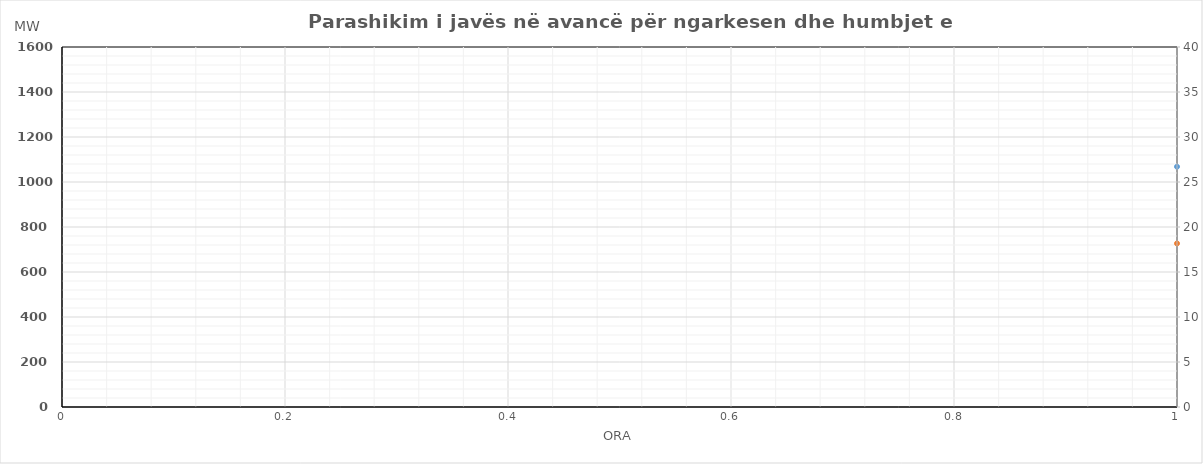
| Category | Ngarkesa (MWh) |
|---|---|
| 0 | 726.941 |
| 1 | 642.054 |
| 2 | 579.283 |
| 3 | 554.908 |
| 4 | 554.458 |
| 5 | 604.217 |
| 6 | 725.592 |
| 7 | 909.808 |
| 8 | 1090.877 |
| 9 | 1157.138 |
| 10 | 1144.061 |
| 11 | 1114.673 |
| 12 | 1110.123 |
| 13 | 1130.889 |
| 14 | 1131 |
| 15 | 1153.556 |
| 16 | 1224.786 |
| 17 | 1349.172 |
| 18 | 1363.365 |
| 19 | 1359.373 |
| 20 | 1310.942 |
| 21 | 1188.383 |
| 22 | 1028.367 |
| 23 | 861.787 |
| 24 | 728.312 |
| 25 | 631.982 |
| 26 | 571.265 |
| 27 | 548.223 |
| 28 | 548.508 |
| 29 | 591.424 |
| 30 | 732.503 |
| 31 | 946.257 |
| 32 | 1094.437 |
| 33 | 1136.702 |
| 34 | 1132.65 |
| 35 | 1115.623 |
| 36 | 1110.276 |
| 37 | 1116.502 |
| 38 | 1113.434 |
| 39 | 1128.112 |
| 40 | 1204.763 |
| 41 | 1312.687 |
| 42 | 1324.339 |
| 43 | 1317.109 |
| 44 | 1266.417 |
| 45 | 1147.149 |
| 46 | 965.113 |
| 47 | 777.027 |
| 48 | 684.763 |
| 49 | 603.225 |
| 50 | 568.87 |
| 51 | 560.554 |
| 52 | 567.641 |
| 53 | 621.65 |
| 54 | 780.791 |
| 55 | 1021.981 |
| 56 | 1151.173 |
| 57 | 1169.899 |
| 58 | 1142.502 |
| 59 | 1124.675 |
| 60 | 1116.155 |
| 61 | 1125.119 |
| 62 | 1126.915 |
| 63 | 1137.301 |
| 64 | 1198.093 |
| 65 | 1297.763 |
| 66 | 1298.464 |
| 67 | 1281.13 |
| 68 | 1235.153 |
| 69 | 1118.443 |
| 70 | 958.055 |
| 71 | 793.458 |
| 72 | 750.08 |
| 73 | 657.031 |
| 74 | 598.135 |
| 75 | 571.537 |
| 76 | 572.15 |
| 77 | 616.353 |
| 78 | 730.369 |
| 79 | 913.775 |
| 80 | 1070.728 |
| 81 | 1109.616 |
| 82 | 1083.069 |
| 83 | 1055.436 |
| 84 | 1042.625 |
| 85 | 1042.142 |
| 86 | 1052.845 |
| 87 | 1078.115 |
| 88 | 1183.127 |
| 89 | 1325.387 |
| 90 | 1347.361 |
| 91 | 1348.665 |
| 92 | 1306.297 |
| 93 | 1188.441 |
| 94 | 1020.752 |
| 95 | 832.065 |
| 96 | 677.938 |
| 97 | 605.796 |
| 98 | 574.146 |
| 99 | 562.861 |
| 100 | 568.676 |
| 101 | 629.303 |
| 102 | 809.988 |
| 103 | 1068.705 |
| 104 | 1179.917 |
| 105 | 1181.059 |
| 106 | 1147.866 |
| 107 | 1118.039 |
| 108 | 1081.987 |
| 109 | 1107.467 |
| 110 | 1156.88 |
| 111 | 1177.525 |
| 112 | 1241.343 |
| 113 | 1340.581 |
| 114 | 1334.715 |
| 115 | 1317.462 |
| 116 | 1290.89 |
| 117 | 1172.423 |
| 118 | 1006.297 |
| 119 | 832.486 |
| 120 | 671.762 |
| 121 | 590.908 |
| 122 | 553.95 |
| 123 | 540.179 |
| 124 | 544.961 |
| 125 | 602.11 |
| 126 | 737.248 |
| 127 | 939.262 |
| 128 | 1098.275 |
| 129 | 1151.432 |
| 130 | 1137.56 |
| 131 | 1112.734 |
| 132 | 1109.37 |
| 133 | 1140.559 |
| 134 | 1150.199 |
| 135 | 1168.193 |
| 136 | 1220.98 |
| 137 | 1326.464 |
| 138 | 1323.306 |
| 139 | 1311.895 |
| 140 | 1271.586 |
| 141 | 1149.139 |
| 142 | 996.427 |
| 143 | 840.556 |
| 144 | 752.45 |
| 145 | 664.387 |
| 146 | 604.766 |
| 147 | 579.916 |
| 148 | 577.888 |
| 149 | 624.42 |
| 150 | 741.656 |
| 151 | 920.456 |
| 152 | 1086.763 |
| 153 | 1131.358 |
| 154 | 1115.378 |
| 155 | 1086.446 |
| 156 | 1074.958 |
| 157 | 1078.413 |
| 158 | 1088.75 |
| 159 | 1110.536 |
| 160 | 1210.216 |
| 161 | 1338.815 |
| 162 | 1354.781 |
| 163 | 1355.767 |
| 164 | 1313.966 |
| 165 | 1200.645 |
| 166 | 1031.841 |
| 167 | 851.372 |